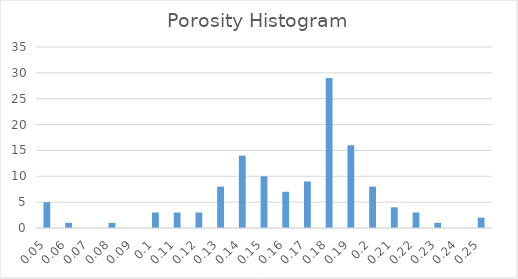
| Category | Series 0 |
|---|---|
| 0.05 | 5 |
| 0.06 | 1 |
| 0.07 | 0 |
| 0.08 | 1 |
| 0.09 | 0 |
| 0.1 | 3 |
| 0.11 | 3 |
| 0.12 | 3 |
| 0.13 | 8 |
| 0.14 | 14 |
| 0.15 | 10 |
| 0.16 | 7 |
| 0.17 | 9 |
| 0.18 | 29 |
| 0.19 | 16 |
| 0.2 | 8 |
| 0.21 | 4 |
| 0.22 | 3 |
| 0.23 | 1 |
| 0.24 | 0 |
| 0.25 | 2 |